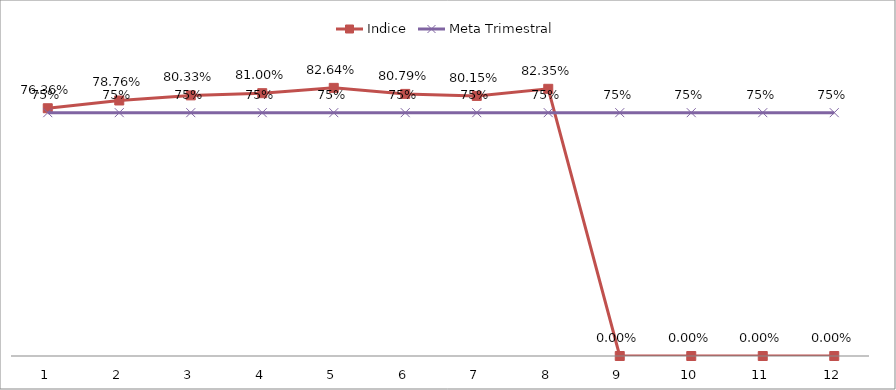
| Category | Indice | Meta Trimestral |
|---|---|---|
| 0 | 0.764 | 0.75 |
| 1 | 0.788 | 0.75 |
| 2 | 0.803 | 0.75 |
| 3 | 0.81 | 0.75 |
| 4 | 0.826 | 0.75 |
| 5 | 0.808 | 0.75 |
| 6 | 0.802 | 0.75 |
| 7 | 0.824 | 0.75 |
| 8 | 0 | 0.75 |
| 9 | 0 | 0.75 |
| 10 | 0 | 0.75 |
| 11 | 0 | 0.75 |